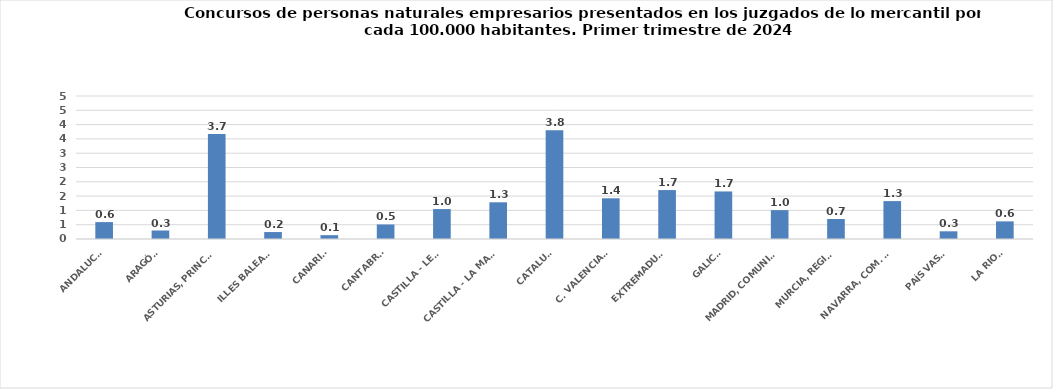
| Category | Series 0 |
|---|---|
| ANDALUCÍA | 0.591 |
| ARAGÓN | 0.297 |
| ASTURIAS, PRINCIPADO | 3.669 |
| ILLES BALEARS | 0.243 |
| CANARIAS | 0.134 |
| CANTABRIA | 0.508 |
| CASTILLA - LEÓN | 1.046 |
| CASTILLA - LA MANCHA | 1.284 |
| CATALUÑA | 3.804 |
| C. VALENCIANA | 1.424 |
| EXTREMADURA | 1.711 |
| GALICIA | 1.663 |
| MADRID, COMUNIDAD | 1.01 |
| MURCIA, REGIÓN | 0.7 |
| NAVARRA, COM. FORAL | 1.325 |
| PAÍS VASCO | 0.269 |
| LA RIOJA | 0.617 |